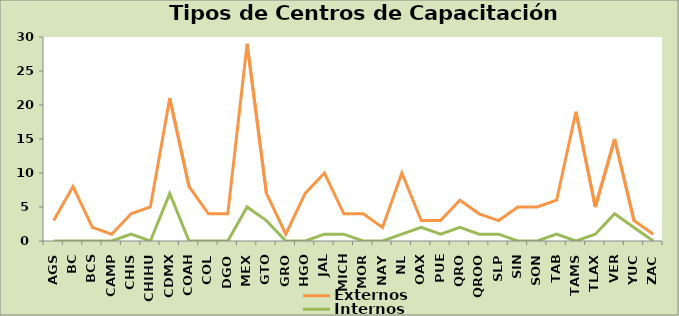
| Category | Externos | Internos |
|---|---|---|
| AGS | 3 | 0 |
| BC | 8 | 0 |
| BCS | 2 | 0 |
| CAMP | 1 | 0 |
| CHIS | 4 | 1 |
| CHIHU | 5 | 0 |
| CDMX | 21 | 7 |
| COAH | 8 | 0 |
| COL | 4 | 0 |
| DGO | 4 | 0 |
| MEX | 29 | 5 |
| GTO | 7 | 3 |
| GRO | 1 | 0 |
| HGO | 7 | 0 |
| JAL | 10 | 1 |
| MICH | 4 | 1 |
| MOR | 4 | 0 |
| NAY | 2 | 0 |
| NL | 10 | 1 |
| OAX | 3 | 2 |
| PUE | 3 | 1 |
| QRO | 6 | 2 |
| QROO | 4 | 1 |
| SLP | 3 | 1 |
| SIN | 5 | 0 |
| SON | 5 | 0 |
| TAB | 6 | 1 |
| TAMS | 19 | 0 |
| TLAX | 5 | 1 |
| VER | 15 | 4 |
| YUC | 3 | 2 |
| ZAC | 1 | 0 |